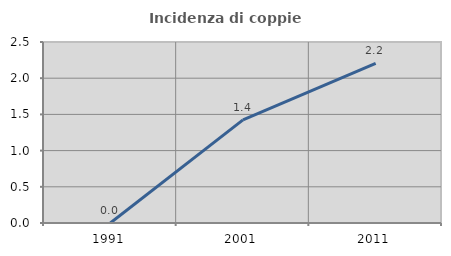
| Category | Incidenza di coppie miste |
|---|---|
| 1991.0 | 0 |
| 2001.0 | 1.425 |
| 2011.0 | 2.206 |